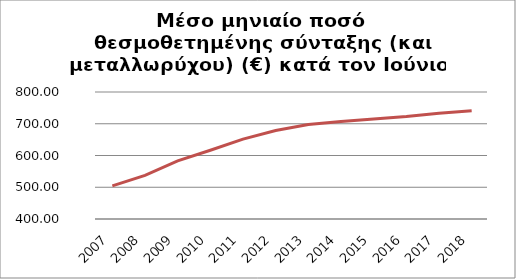
| Category | Series 1 |
|---|---|
| 2007.0 | 504.426 |
| 2008.0 | 537.591 |
| 2009.0 | 582.94 |
| 2010.0 | 616.567 |
| 2011.0 | 651.509 |
| 2012.0 | 678.951 |
| 2013.0 | 697.458 |
| 2014.0 | 707.063 |
| 2015.0 | 715.126 |
| 2016.0 | 722.83 |
| 2017.0 | 732.9 |
| 2018.0 | 740.61 |